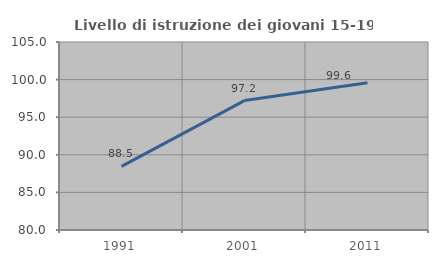
| Category | Livello di istruzione dei giovani 15-19 anni |
|---|---|
| 1991.0 | 88.451 |
| 2001.0 | 97.213 |
| 2011.0 | 99.592 |